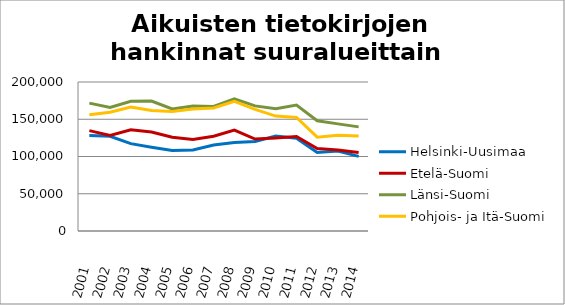
| Category | Helsinki-Uusimaa | Etelä-Suomi | Länsi-Suomi | Pohjois- ja Itä-Suomi |
|---|---|---|---|---|
| 2001.0 | 128103 | 134747 | 171638 | 155967 |
| 2002.0 | 127163 | 128152 | 165713 | 159393 |
| 2003.0 | 117280 | 135759 | 174047 | 166345 |
| 2004.0 | 112489 | 132784 | 174472 | 161840 |
| 2005.0 | 108057 | 125895 | 163856 | 160367 |
| 2006.0 | 108800 | 122684 | 167797 | 163845 |
| 2007.0 | 115509 | 127107 | 167075 | 165203 |
| 2008.0 | 118823 | 135530 | 177300 | 173935 |
| 2009.0 | 120113 | 123418 | 167942 | 163222 |
| 2010.0 | 127383 | 124960 | 164249 | 154278 |
| 2011.0 | 124421 | 126956 | 168982 | 152347 |
| 2012.0 | 105311 | 110602 | 148052 | 125939 |
| 2013.0 | 107267 | 108758 | 143812 | 128642 |
| 2014.0 | 100158 | 105344 | 139752 | 127525 |